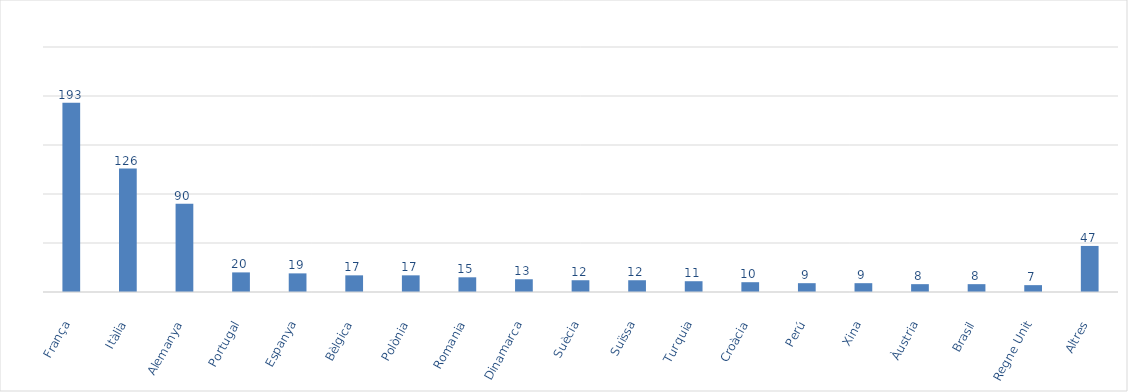
| Category | Series 0 |
|---|---|
| França | 193 |
| Itàlia | 126 |
| Alemanya | 90 |
| Portugal | 20 |
| Espanya | 19 |
| Bèlgica | 17 |
| Polònia | 17 |
| Romania | 15 |
| Dinamarca | 13 |
| Suècia | 12 |
| Suïssa | 12 |
| Turquia | 11 |
| Croàcia | 10 |
| Perú | 9 |
| Xina | 9 |
| Àustria | 8 |
| Brasil | 8 |
| Regne Unit | 7 |
| Altres | 47 |